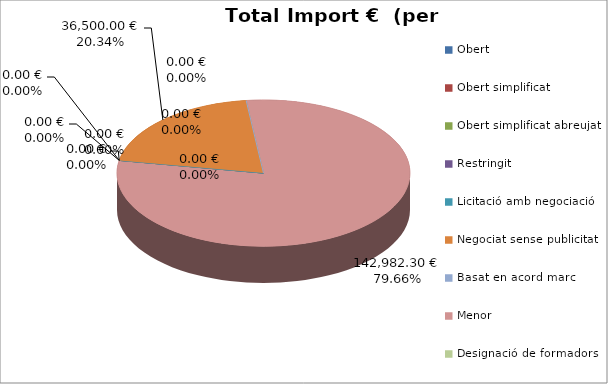
| Category | Total preu              (amb iva) |
|---|---|
| Obert | 0 |
| Obert simplificat | 0 |
| Obert simplificat abreujat | 0 |
| Restringit | 0 |
| Licitació amb negociació | 0 |
| Negociat sense publicitat | 36500 |
| Basat en acord marc | 0 |
| Menor | 142982.3 |
| Designació de formadors | 0 |